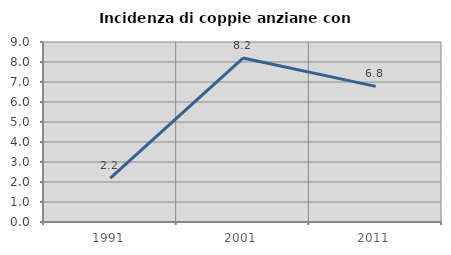
| Category | Incidenza di coppie anziane con figli |
|---|---|
| 1991.0 | 2.198 |
| 2001.0 | 8.197 |
| 2011.0 | 6.78 |